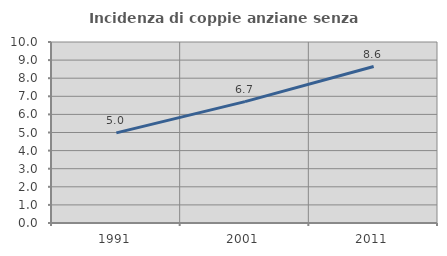
| Category | Incidenza di coppie anziane senza figli  |
|---|---|
| 1991.0 | 4.979 |
| 2001.0 | 6.704 |
| 2011.0 | 8.645 |